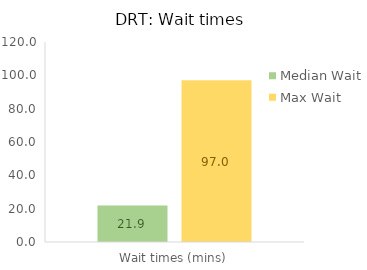
| Category | Median Wait | Max Wait |
|---|---|---|
| 0 | 21.883 | 96.975 |